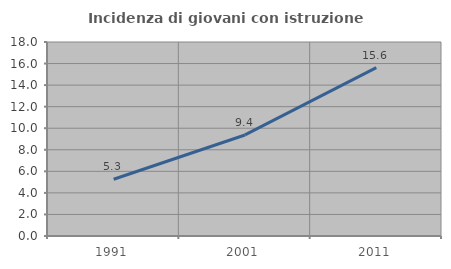
| Category | Incidenza di giovani con istruzione universitaria |
|---|---|
| 1991.0 | 5.263 |
| 2001.0 | 9.375 |
| 2011.0 | 15.625 |